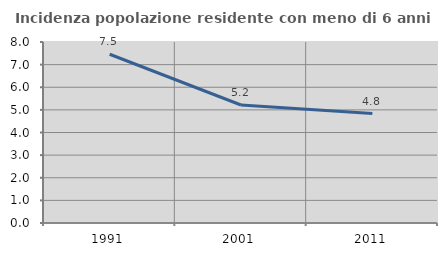
| Category | Incidenza popolazione residente con meno di 6 anni |
|---|---|
| 1991.0 | 7.459 |
| 2001.0 | 5.215 |
| 2011.0 | 4.838 |